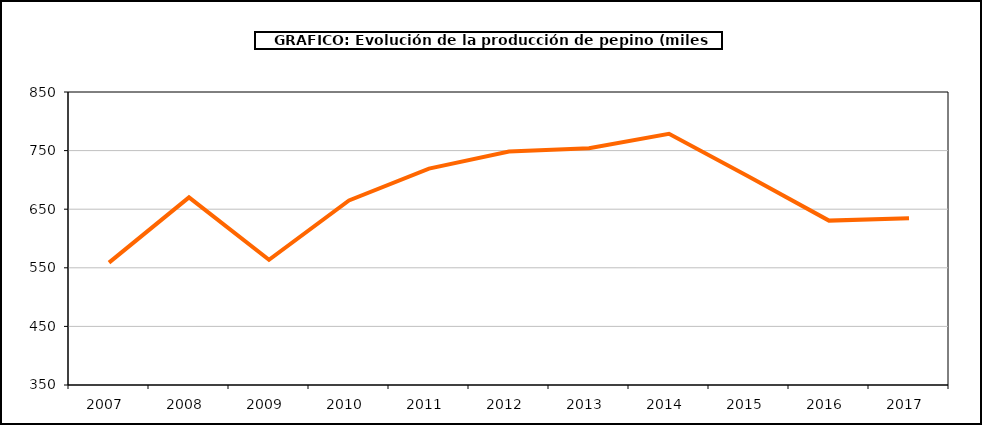
| Category | producción |
|---|---|
| 2007.0 | 558.817 |
| 2008.0 | 670.162 |
| 2009.0 | 563.566 |
| 2010.0 | 664.975 |
| 2011.0 | 719.219 |
| 2012.0 | 748.5 |
| 2013.0 | 753.941 |
| 2014.0 | 778.571 |
| 2015.0 | 705.223 |
| 2016.0 | 630.525 |
| 2017.0 | 634.43 |